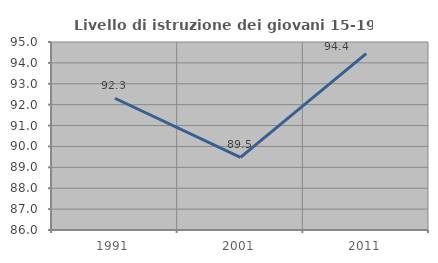
| Category | Livello di istruzione dei giovani 15-19 anni |
|---|---|
| 1991.0 | 92.308 |
| 2001.0 | 89.474 |
| 2011.0 | 94.444 |